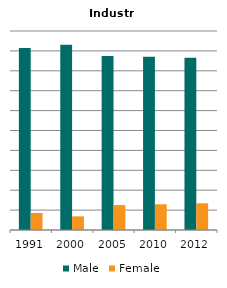
| Category | Male | Female |
|---|---|---|
| 1991.0 | 0.914 | 0.086 |
| 2000.0 | 0.931 | 0.069 |
| 2005.0 | 0.875 | 0.125 |
| 2010.0 | 0.871 | 0.129 |
| 2012.0 | 0.866 | 0.134 |